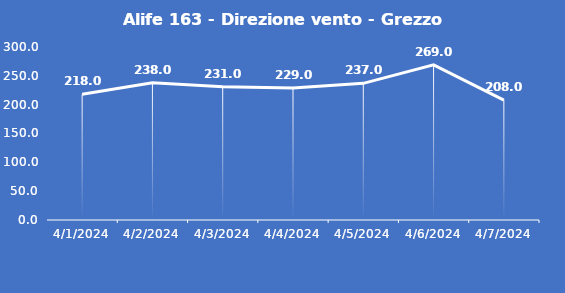
| Category | Alife 163 - Direzione vento - Grezzo (°N) |
|---|---|
| 4/1/24 | 218 |
| 4/2/24 | 238 |
| 4/3/24 | 231 |
| 4/4/24 | 229 |
| 4/5/24 | 237 |
| 4/6/24 | 269 |
| 4/7/24 | 208 |